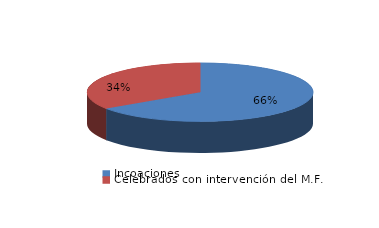
| Category | Series 0 |
|---|---|
| Incoaciones | 11123 |
| Celebrados con intervención del M.F. | 5854 |